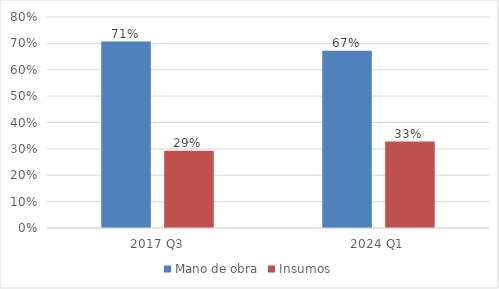
| Category | Mano de obra | Insumos |
|---|---|---|
| 2017 Q3 | 0.707 | 0.293 |
| 2024 Q1 | 0.672 | 0.328 |